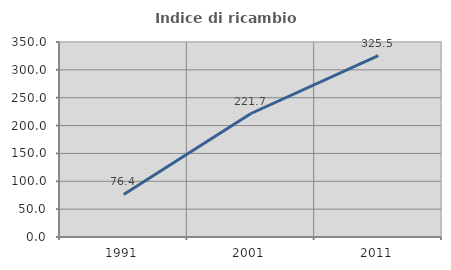
| Category | Indice di ricambio occupazionale  |
|---|---|
| 1991.0 | 76.389 |
| 2001.0 | 221.667 |
| 2011.0 | 325.455 |